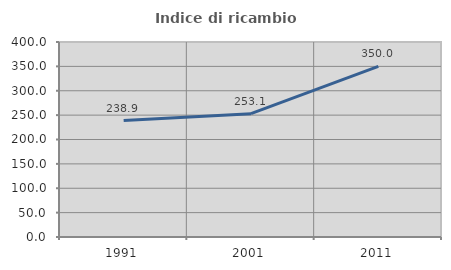
| Category | Indice di ricambio occupazionale  |
|---|---|
| 1991.0 | 238.947 |
| 2001.0 | 253.061 |
| 2011.0 | 350 |